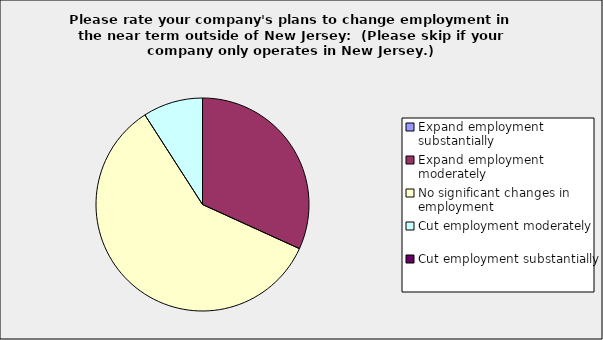
| Category | Series 0 |
|---|---|
| Expand employment substantially | 0 |
| Expand employment moderately | 0.318 |
| No significant changes in employment | 0.591 |
| Cut employment moderately | 0.091 |
| Cut employment substantially | 0 |